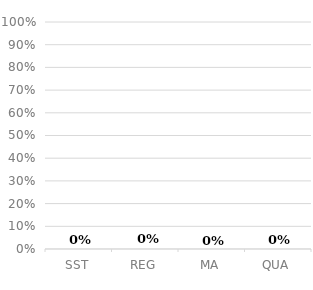
| Category | Series 0 |
|---|---|
| SST | 0 |
| REG | 0 |
| MA | 0 |
| QUA | 0 |